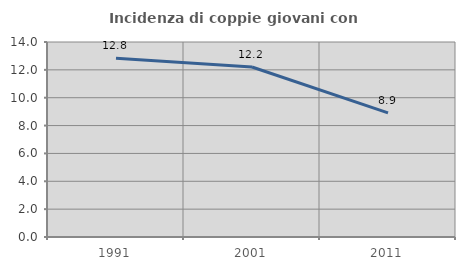
| Category | Incidenza di coppie giovani con figli |
|---|---|
| 1991.0 | 12.834 |
| 2001.0 | 12.207 |
| 2011.0 | 8.915 |